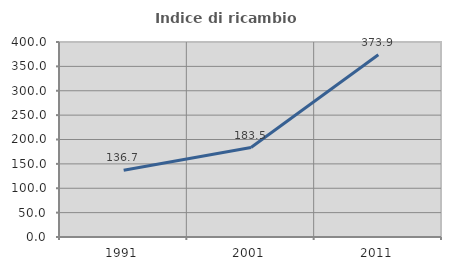
| Category | Indice di ricambio occupazionale  |
|---|---|
| 1991.0 | 136.744 |
| 2001.0 | 183.531 |
| 2011.0 | 373.873 |